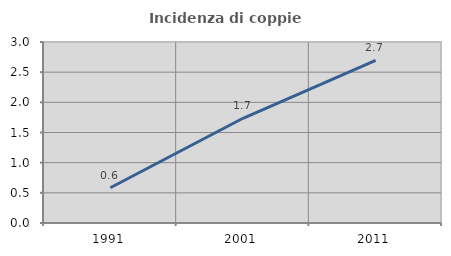
| Category | Incidenza di coppie miste |
|---|---|
| 1991.0 | 0.584 |
| 2001.0 | 1.736 |
| 2011.0 | 2.696 |